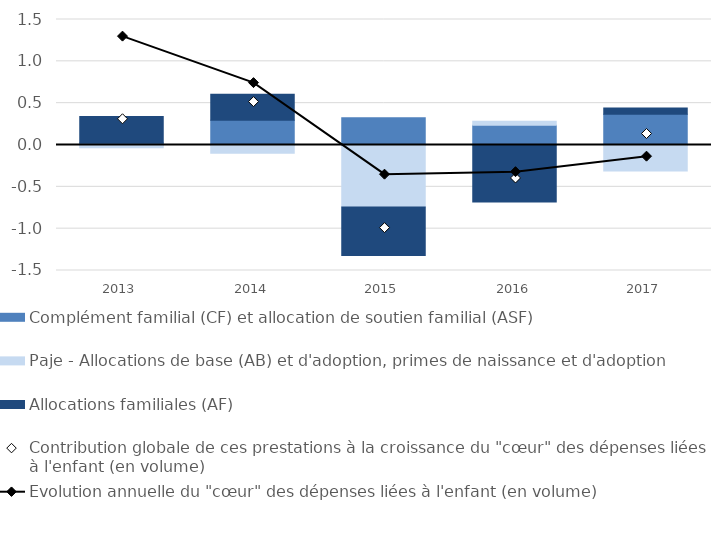
| Category | Complément familial (CF) et allocation de soutien familial (ASF) | Paje - Allocations de base (AB) et d'adoption, primes de naissance et d'adoption | Allocations familiales (AF) |
|---|---|---|---|
| 2013.0 | 0.024 | -0.032 | 0.315 |
| 2014.0 | 0.296 | -0.098 | 0.312 |
| 2015.0 | 0.326 | -0.742 | -0.578 |
| 2016.0 | 0.237 | 0.047 | -0.682 |
| 2017.0 | 0.366 | -0.31 | 0.076 |